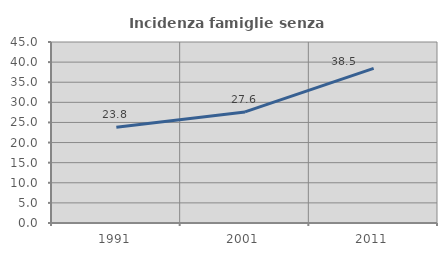
| Category | Incidenza famiglie senza nuclei |
|---|---|
| 1991.0 | 23.831 |
| 2001.0 | 27.619 |
| 2011.0 | 38.452 |